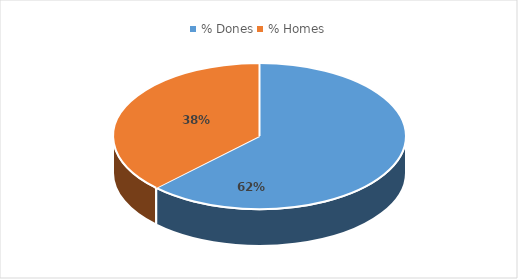
| Category | Series 0 |
|---|---|
| % Dones | 0.624 |
| % Homes | 0.376 |